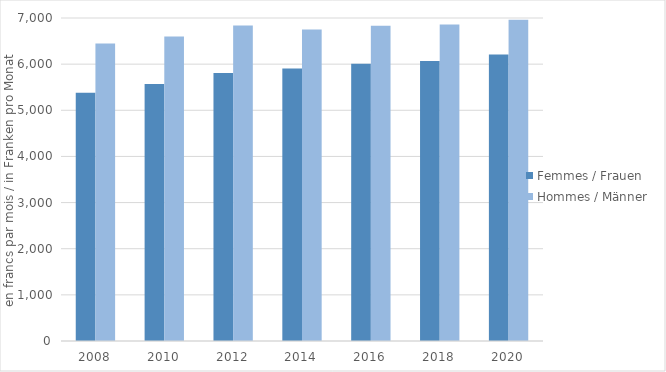
| Category | Femmes / Frauen | Hommes / Männer |
|---|---|---|
| 2008.0 | 5382 | 6450 |
| 2010.0 | 5569 | 6601 |
| 2012.0 | 5808 | 6840 |
| 2014.0 | 5907 | 6751 |
| 2016.0 | 6011 | 6830 |
| 2018.0 | 6067 | 6857 |
| 2020.0 | 6211 | 6963 |